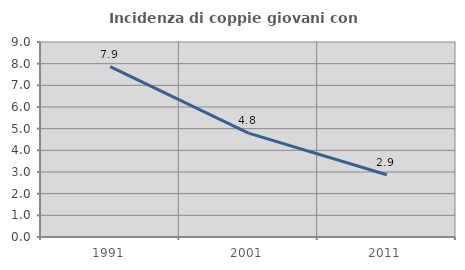
| Category | Incidenza di coppie giovani con figli |
|---|---|
| 1991.0 | 7.867 |
| 2001.0 | 4.796 |
| 2011.0 | 2.872 |